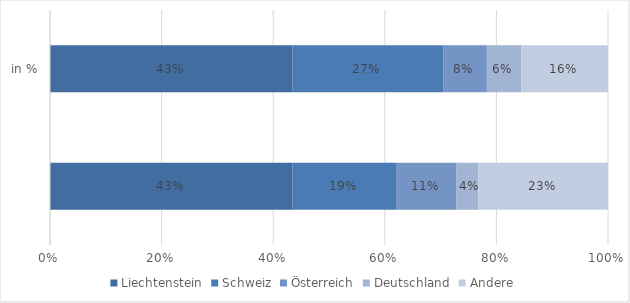
| Category | Liechtenstein | Schweiz | Österreich | Deutschland | Andere |
|---|---|---|---|---|---|
| 0 | 0.434 | 0.186 | 0.109 | 0.039 | 0.233 |
| 1 | 0.434 | 0.271 | 0.078 | 0.062 | 0.155 |